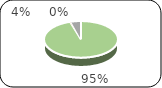
| Category | Series 0 |
|---|---|
| 0 | 103861049.92 |
| 1 | 483701.48 |
| 2 | 4732066.65 |